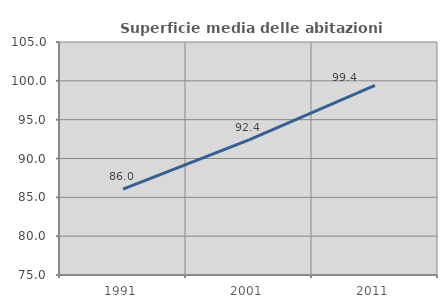
| Category | Superficie media delle abitazioni occupate |
|---|---|
| 1991.0 | 86.048 |
| 2001.0 | 92.403 |
| 2011.0 | 99.406 |